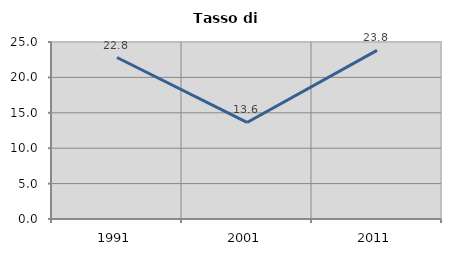
| Category | Tasso di disoccupazione   |
|---|---|
| 1991.0 | 22.807 |
| 2001.0 | 13.636 |
| 2011.0 | 23.81 |